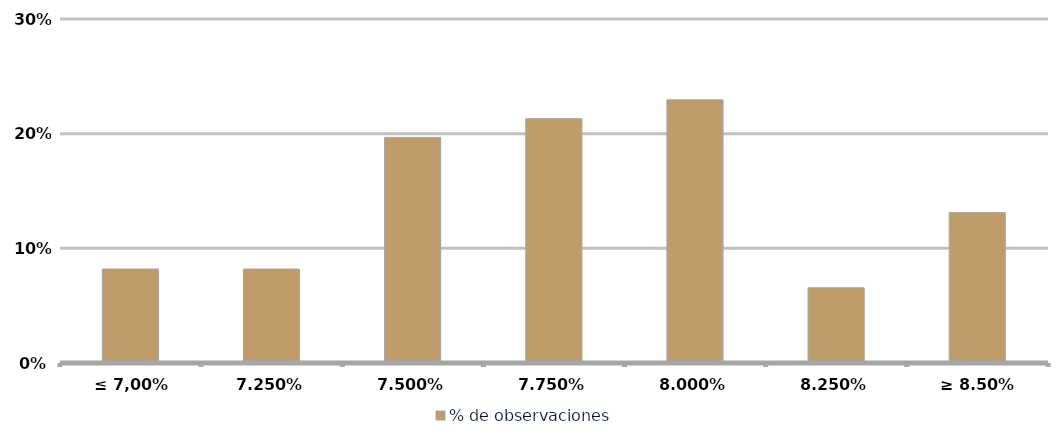
| Category | % de observaciones  |
|---|---|
| ≤ 7,00% | 0.082 |
| 7.25% | 0.082 |
| 7.50% | 0.197 |
| 7.75% | 0.213 |
| 8.00% | 0.23 |
| 8.25% | 0.066 |
| ≥ 8.50% | 0.131 |